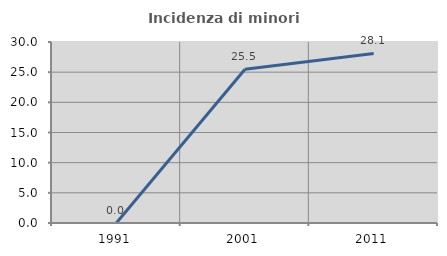
| Category | Incidenza di minori stranieri |
|---|---|
| 1991.0 | 0 |
| 2001.0 | 25.49 |
| 2011.0 | 28.105 |